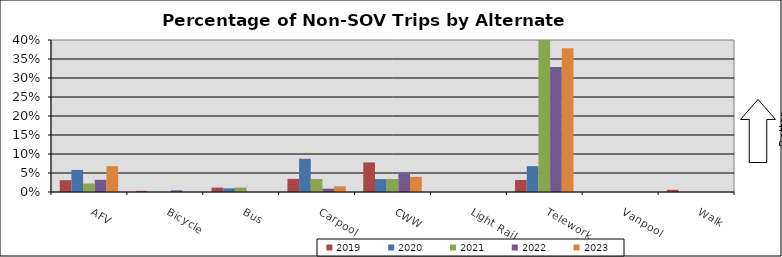
| Category | 2019 | 2020 | 2021 | 2022 | 2023 |
|---|---|---|---|---|---|
| AFV | 0.031 | 0.058 | 0.022 | 0.032 | 0.068 |
| Bicycle | 0.003 | 0 | 0 | 0.004 | 0 |
| Bus | 0.012 | 0.01 | 0.011 | 0 | 0 |
| Carpool | 0.035 | 0.087 | 0.034 | 0.009 | 0.015 |
| CWW | 0.078 | 0.034 | 0.034 | 0.048 | 0.04 |
| Light Rail | 0 | 0 | 0 | 0 | 0 |
| Telework | 0.032 | 0.068 | 0.411 | 0.329 | 0.378 |
| Vanpool | 0 | 0 | 0 | 0 | 0 |
| Walk | 0.006 | 0 | 0 | 0 | 0 |